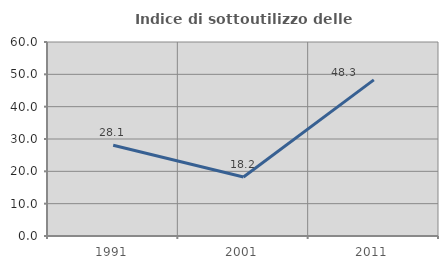
| Category | Indice di sottoutilizzo delle abitazioni  |
|---|---|
| 1991.0 | 28.054 |
| 2001.0 | 18.229 |
| 2011.0 | 48.276 |